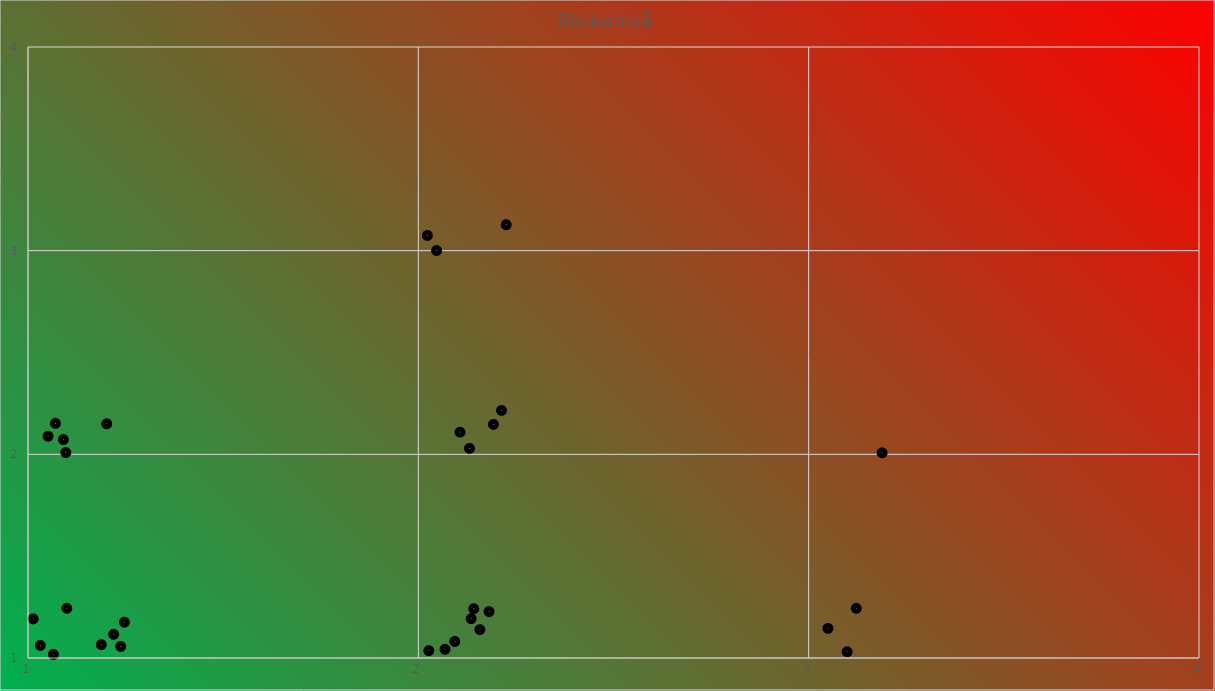
| Category | Risikoverdi |
|---|---|
| 2.0683195526066536 | 1.043 |
| 2.1310366513362617 | 2.029 |
| 2.106808975374672 | 2.109 |
| 2.2250740234875925 | 3.127 |
| 1.1810678782601605 | 4.207 |
| 1.1601289429570283 | 4.159 |
| 2.192417891927338 | 2.147 |
| 2.026794864595089 | 1.036 |
| 1.187744694728319 | 1.066 |
| 1.2376633569476403 | 1.057 |
| 2.093350327478457 | 1.081 |
| 2.1353384067628367 | 1.193 |
| 3.049320317933495 | 1.145 |
| 0.0 | 0 |
| 0.0 | 0 |
| 0.0 | 0 |
| 1.0906325030540869 | 2.073 |
| 0.0 | 0 |
| 1.0514860409021662 | 2.089 |
| 1.0703805047898822 | 2.152 |
| 0.0 | 0 |
| 0.0 | 0 |
| 1.0995506677307598 | 1.244 |
| 0.0 | 1.053 |
| 2.157713080115948 | 1.139 |
| 2.1811435162348114 | 1.228 |
| 2.0467360020478202 | 3.001 |
| 2.0231584345974123 | 3.075 |
| 4.110729555311595 | 0 |
| 4.078523151316287 | 3.191 |
| 2.1420373778620796 | 1.242 |
| 0.0 | 0 |
| 3.1219712297443873 | 1.244 |
| 1.0315980995445102 | 1.062 |
| 3.098541293206139 | 1.031 |
| 1.219527280110509 | 1.116 |
| 1.2016262374803723 | 2.15 |
| 1.24700518430548 | 1.176 |
| 1.065169030319209 | 1.018 |
| 1.0133479009477477 | 1.192 |
| 1.0969491715450532 | 2.009 |
| 2.2131564428974406 | 2.216 |
| 3.188061655093886 | 2.008 |
| 2.1131980483246924 | 0.227 |
| 0.21288986851419422 | 0.091 |
| 0.08603570727955853 | 0.081 |
| 0.005719256218808394 | 0.071 |
| 0.12388290786446321 | 0.125 |